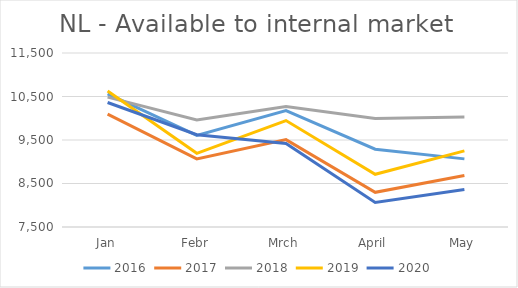
| Category | 2016 | 2017 | 2018 | 2019 | 2020 |
|---|---|---|---|---|---|
| Jan | 10559 | 10094 | 10485 | 10626.933 | 10362.095 |
| Febr | 9607 | 9066 | 9959 | 9193.272 | 9620.498 |
| Mrch | 10176 | 9508 | 10272 | 9946.418 | 9419.767 |
| April | 9289 | 8297 | 9993 | 8711.929 | 8063.729 |
| May | 9066 | 8685 | 10026 | 9249.47 | 8362.928 |